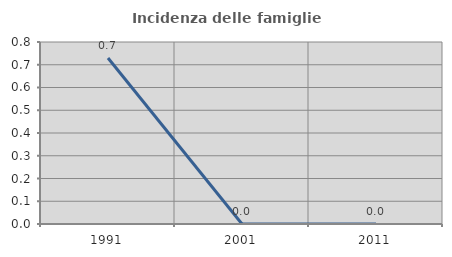
| Category | Incidenza delle famiglie numerose |
|---|---|
| 1991.0 | 0.73 |
| 2001.0 | 0 |
| 2011.0 | 0 |